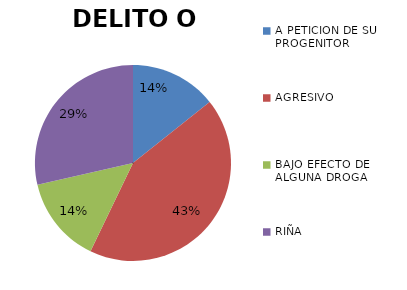
| Category | DELITO O FALTA |
|---|---|
| A PETICION DE SU PROGENITOR | 1 |
| AGRESIVO | 3 |
| BAJO EFECTO DE ALGUNA DROGA | 1 |
| RIÑA | 2 |